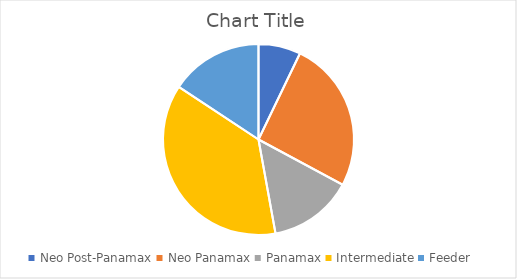
| Category | Series 0 |
|---|---|
| Neo Post-Panamax | 5 |
| Neo Panamax | 18 |
| Panamax | 10 |
| Intermediate | 26 |
| Feeder | 11 |